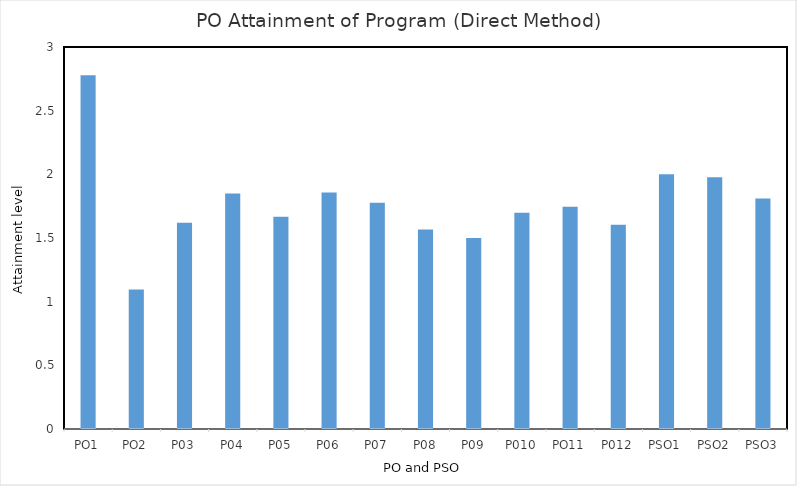
| Category | PO1 |
|---|---|
| PO1 | 2.778 |
| PO2 | 1.095 |
| P03 | 1.619 |
| P04 | 1.849 |
| P05 | 1.667 |
| P06 | 1.857 |
| P07 | 1.778 |
| P08 | 1.567 |
| P09 | 1.5 |
| P010 | 1.698 |
| PO11 | 1.746 |
| P012 | 1.603 |
| PSO1 | 2 |
| PSO2 | 1.976 |
| PSO3 | 1.81 |